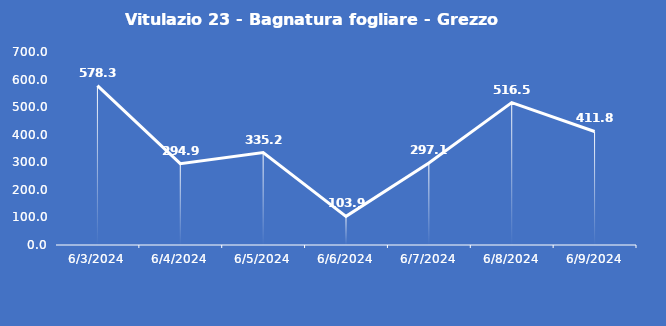
| Category | Vitulazio 23 - Bagnatura fogliare - Grezzo (min) |
|---|---|
| 6/3/24 | 578.3 |
| 6/4/24 | 294.9 |
| 6/5/24 | 335.2 |
| 6/6/24 | 103.9 |
| 6/7/24 | 297.1 |
| 6/8/24 | 516.5 |
| 6/9/24 | 411.8 |